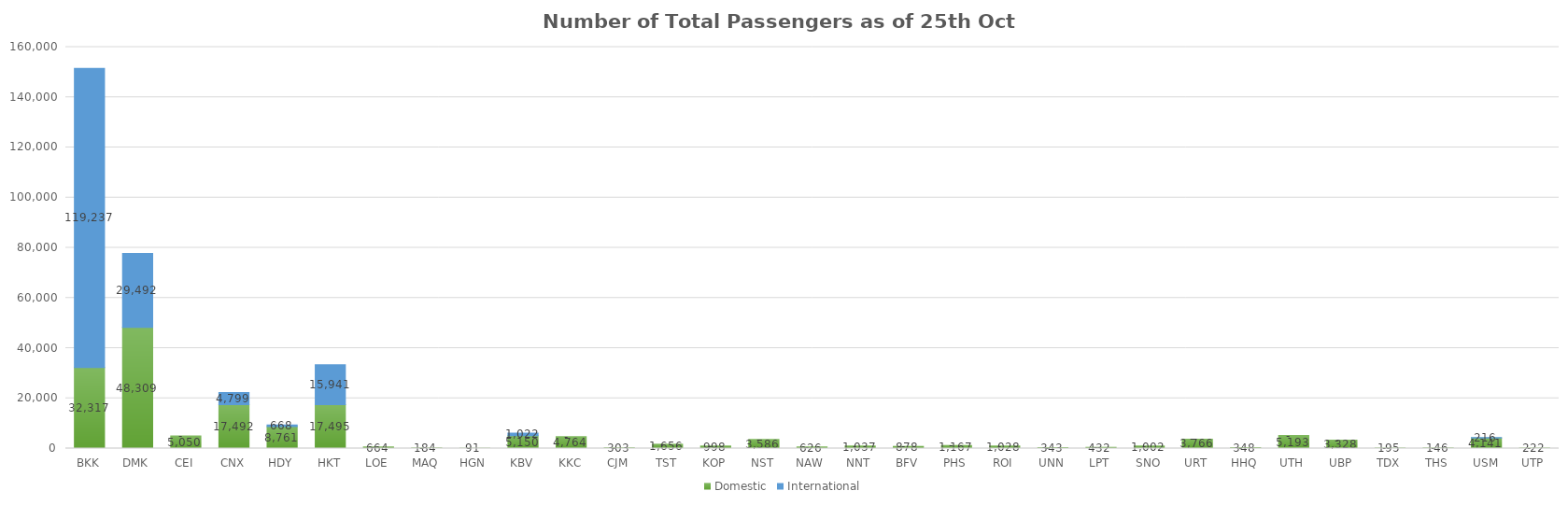
| Category | Domestic | International |
|---|---|---|
| BKK | 32317 | 119237 |
| DMK | 48309 | 29492 |
| CEI | 5050 | 0 |
| CNX | 17492 | 4799 |
| HDY | 8761 | 668 |
| HKT | 17495 | 15941 |
| LOE | 664 | 0 |
| MAQ | 184 | 0 |
| HGN | 91 | 0 |
| KBV | 5150 | 1022 |
| KKC | 4764 | 0 |
| CJM | 303 | 0 |
| TST | 1656 | 0 |
| KOP | 998 | 0 |
| NST | 3586 | 0 |
| NAW | 626 | 0 |
| NNT | 1037 | 0 |
| BFV | 878 | 0 |
| PHS | 1167 | 0 |
| ROI | 1028 | 0 |
| UNN | 343 | 0 |
| LPT | 432 | 0 |
| SNO | 1002 | 0 |
| URT | 3766 | 0 |
| HHQ | 348 | 0 |
| UTH | 5193 | 0 |
| UBP | 3328 | 0 |
| TDX | 195 | 0 |
| THS | 146 | 0 |
| USM | 4141 | 216 |
| UTP | 222 | 0 |